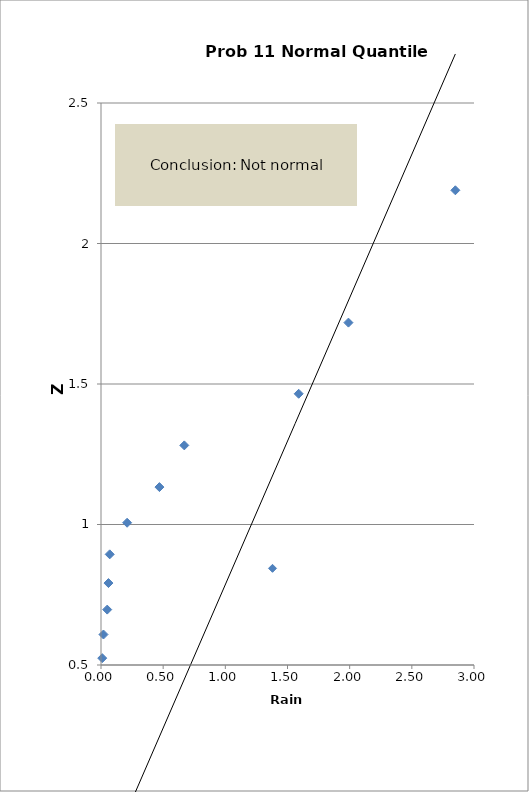
| Category | Y |
|---|---|
| 0.0 | -2.189 |
| 0.0 | -1.718 |
| 0.0 | -1.465 |
| 0.0 | -1.282 |
| 0.0 | -1.133 |
| 0.0 | -1.006 |
| 0.0 | -0.894 |
| 0.0 | -0.792 |
| 0.0 | -0.697 |
| 0.0 | -0.608 |
| 0.0 | -0.524 |
| 0.0 | -0.444 |
| 0.0 | -0.366 |
| 0.0 | -0.291 |
| 0.0 | -0.217 |
| 0.0 | -0.144 |
| 0.0 | -0.072 |
| 0.0 | 0 |
| 0.0 | 0.072 |
| 0.01 | 0.144 |
| 0.01 | 0.217 |
| 0.01 | 0.291 |
| 0.01 | 0.366 |
| 0.01 | 0.444 |
| 0.01 | 0.524 |
| 0.02 | 0.608 |
| 0.05 | 0.697 |
| 0.06 | 0.792 |
| 0.07 | 0.894 |
| 0.21 | 1.006 |
| 0.47 | 1.133 |
| 0.67 | 1.282 |
| 1.59 | 1.465 |
| 1.99 | 1.718 |
| 2.85 | 2.189 |